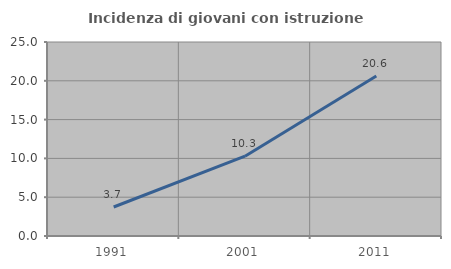
| Category | Incidenza di giovani con istruzione universitaria |
|---|---|
| 1991.0 | 3.738 |
| 2001.0 | 10.28 |
| 2011.0 | 20.619 |